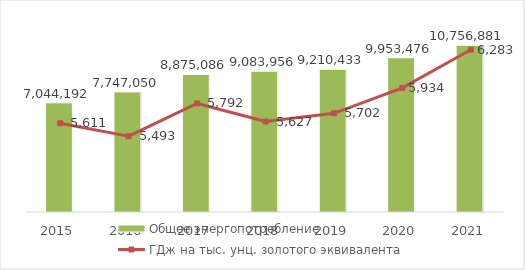
| Category | Общее энергопотребление |
|---|---|
| 2015.0 | 7044192 |
| 2016.0 | 7747050 |
| 2017.0 | 8875086 |
| 2018.0 | 9083956 |
| 2019.0 | 9210433 |
| 2020.0 | 9953476 |
| 2021.0 | 10756881 |